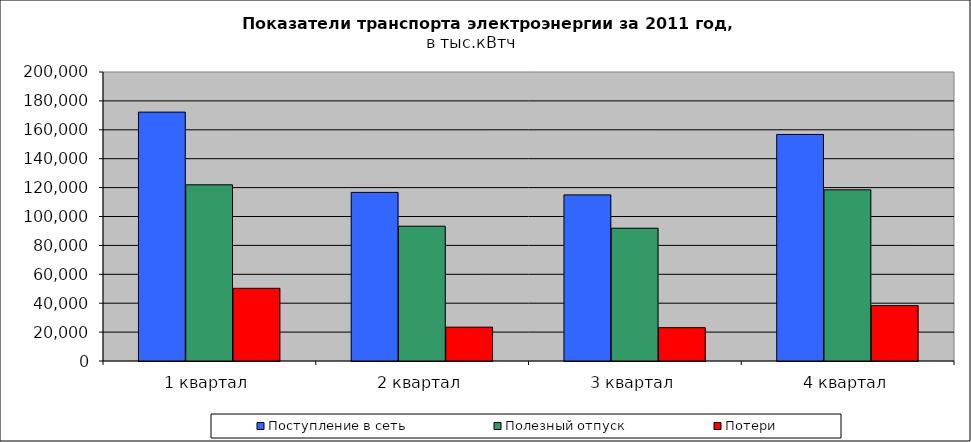
| Category | Поступление в сеть | Полезный отпуск | Потери |
|---|---|---|---|
| 1 квартал | 172233.305 | 121937.983 | 50295.322 |
| 2 квартал | 116677.976 | 93263.786 | 23414.19 |
| 3 квартал | 114958.273 | 91887.565 | 23070.708 |
| 4 квартал | 156780.612 | 118448.669 | 38331.943 |